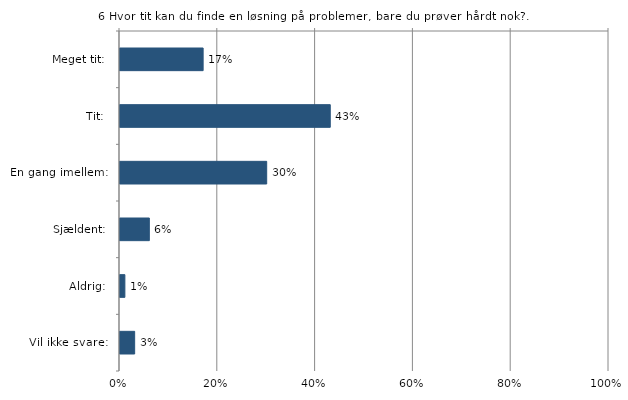
| Category | Hvor tit kan du finde en løsning på problemer, bare du prøver hårdt nok? |
|---|---|
| Meget tit:  | 0.17 |
| Tit:  | 0.43 |
| En gang imellem:  | 0.3 |
| Sjældent:  | 0.06 |
| Aldrig:  | 0.01 |
| Vil ikke svare:  | 0.03 |